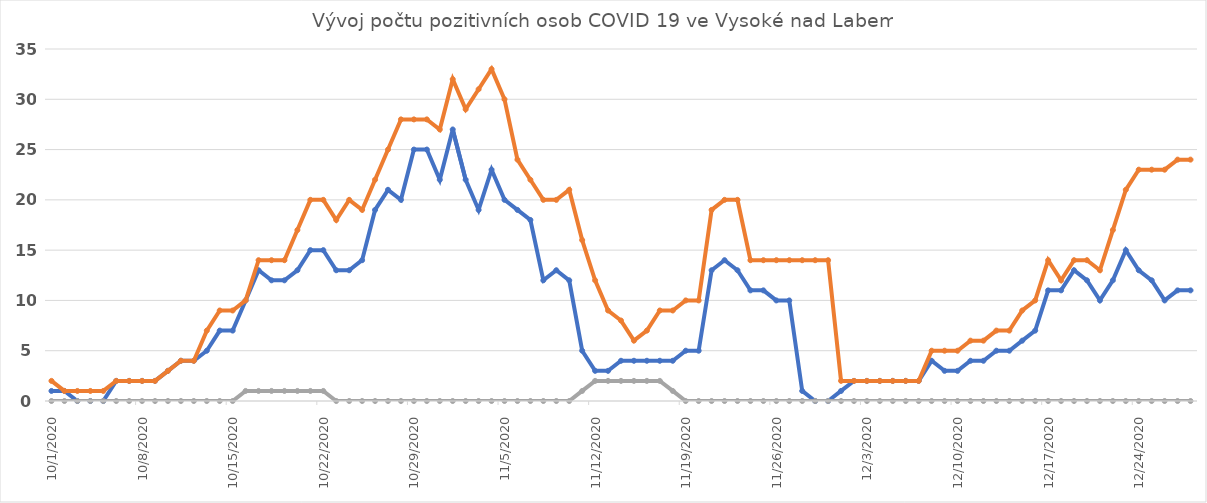
| Category | Series 0 | Series 1 | Series 2 |
|---|---|---|---|
| 10/1/20 | 1 | 2 | 0 |
| 10/2/20 | 1 | 1 | 0 |
| 10/3/20 | 0 | 1 | 0 |
| 10/4/20 | 0 | 1 | 0 |
| 10/5/20 | 0 | 1 | 0 |
| 10/6/20 | 2 | 2 | 0 |
| 10/7/20 | 2 | 2 | 0 |
| 10/8/20 | 2 | 2 | 0 |
| 10/9/20 | 2 | 2 | 0 |
| 10/10/20 | 3 | 3 | 0 |
| 10/11/20 | 4 | 4 | 0 |
| 10/12/20 | 4 | 4 | 0 |
| 10/13/20 | 5 | 7 | 0 |
| 10/14/20 | 7 | 9 | 0 |
| 10/15/20 | 7 | 9 | 0 |
| 10/16/20 | 10 | 10 | 1 |
| 10/17/20 | 13 | 14 | 1 |
| 10/18/20 | 12 | 14 | 1 |
| 10/19/20 | 12 | 14 | 1 |
| 10/20/20 | 13 | 17 | 1 |
| 10/21/20 | 15 | 20 | 1 |
| 10/22/20 | 15 | 20 | 1 |
| 10/23/20 | 13 | 18 | 0 |
| 10/24/20 | 13 | 20 | 0 |
| 10/25/20 | 14 | 19 | 0 |
| 10/26/20 | 19 | 22 | 0 |
| 10/27/20 | 21 | 25 | 0 |
| 10/28/20 | 20 | 28 | 0 |
| 10/29/20 | 25 | 28 | 0 |
| 10/30/20 | 25 | 28 | 0 |
| 10/31/20 | 22 | 27 | 0 |
| 11/1/20 | 27 | 32 | 0 |
| 11/2/20 | 22 | 29 | 0 |
| 11/3/20 | 19 | 31 | 0 |
| 11/4/20 | 23 | 33 | 0 |
| 11/5/20 | 20 | 30 | 0 |
| 11/6/20 | 19 | 24 | 0 |
| 11/7/20 | 18 | 22 | 0 |
| 11/8/20 | 12 | 20 | 0 |
| 11/9/20 | 13 | 20 | 0 |
| 11/10/20 | 12 | 21 | 0 |
| 11/11/20 | 5 | 16 | 1 |
| 11/12/20 | 3 | 12 | 2 |
| 11/13/20 | 3 | 9 | 2 |
| 11/14/20 | 4 | 8 | 2 |
| 11/15/20 | 4 | 6 | 2 |
| 11/16/20 | 4 | 7 | 2 |
| 11/17/20 | 4 | 9 | 2 |
| 11/18/20 | 4 | 9 | 1 |
| 11/19/20 | 5 | 10 | 0 |
| 11/20/20 | 5 | 10 | 0 |
| 11/21/20 | 13 | 19 | 0 |
| 11/22/20 | 14 | 20 | 0 |
| 11/23/20 | 13 | 20 | 0 |
| 11/24/20 | 11 | 14 | 0 |
| 11/25/20 | 11 | 14 | 0 |
| 11/26/20 | 10 | 14 | 0 |
| 11/27/20 | 10 | 14 | 0 |
| 11/28/20 | 1 | 14 | 0 |
| 11/29/20 | 0 | 14 | 0 |
| 11/30/20 | 0 | 14 | 0 |
| 12/1/20 | 1 | 2 | 0 |
| 12/2/20 | 2 | 2 | 0 |
| 12/3/20 | 2 | 2 | 0 |
| 12/4/20 | 2 | 2 | 0 |
| 12/5/20 | 2 | 2 | 0 |
| 12/6/20 | 2 | 2 | 0 |
| 12/7/20 | 2 | 2 | 0 |
| 12/8/20 | 4 | 5 | 0 |
| 12/9/20 | 3 | 5 | 0 |
| 12/10/20 | 3 | 5 | 0 |
| 12/11/20 | 4 | 6 | 0 |
| 12/12/20 | 4 | 6 | 0 |
| 12/13/20 | 5 | 7 | 0 |
| 12/14/20 | 5 | 7 | 0 |
| 12/15/20 | 6 | 9 | 0 |
| 12/16/20 | 7 | 10 | 0 |
| 12/17/20 | 11 | 14 | 0 |
| 12/18/20 | 11 | 12 | 0 |
| 12/19/20 | 13 | 14 | 0 |
| 12/20/20 | 12 | 14 | 0 |
| 12/21/20 | 10 | 13 | 0 |
| 12/22/20 | 12 | 17 | 0 |
| 12/23/20 | 15 | 21 | 0 |
| 12/24/20 | 13 | 23 | 0 |
| 12/25/20 | 12 | 23 | 0 |
| 12/26/20 | 10 | 23 | 0 |
| 12/27/20 | 11 | 24 | 0 |
| 12/28/20 | 11 | 24 | 0 |